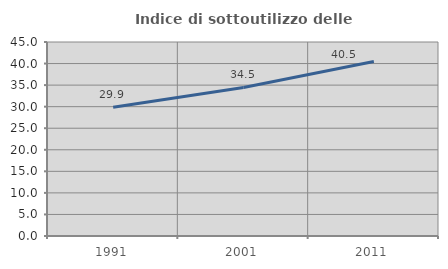
| Category | Indice di sottoutilizzo delle abitazioni  |
|---|---|
| 1991.0 | 29.851 |
| 2001.0 | 34.467 |
| 2011.0 | 40.483 |